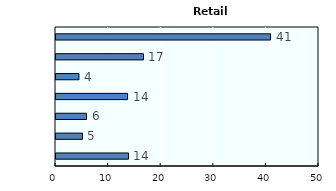
| Category | Retail trade |
|---|---|
| Chamber of commerce | 13.783 |
| Female group | 5.028 |
| Group similar jobs | 5.802 |
| Industry group | 13.609 |
| Other | 4.362 |
| SME group | 16.627 |
| None | 40.79 |